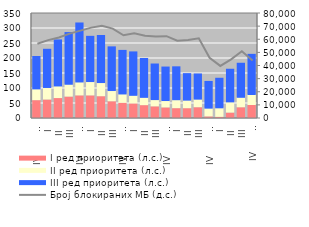
| Category | I ред приоритета (л.с.) | II ред приоритета (л.с.) | III ред приоритета (л.с.) |
|---|---|---|---|
| IV          2008. | 59.472 | 39.229 | 107.94 |
| I | 61.628 | 41.804 | 127.293 |
| II | 66.48 | 41.998 | 153.529 |
| III | 71.435 | 42.715 | 172.249 |
| IV          2009. | 75.406 | 46.374 | 196.604 |
| I | 75.387 | 47.741 | 150.747 |
| II | 72.673 | 47.129 | 156.885 |
| III | 55.827 | 37.398 | 145.555 |
| IV          2010. | 50.741 | 31.052 | 145.204 |
| I | 48.642 | 28.609 | 144.705 |
| II | 42.849 | 27.657 | 129.494 |
| III | 38.871 | 24.155 | 118.602 |
| IV          2011. | 35.298 | 24.577 | 111.631 |
| I | 32.81 | 29.818 | 109.618 |
| II | 32.726 | 28.5 | 88.254 |
| III | 35.976 | 28.552 | 83.929 |
| IV          2012. | 5.368 | 29.141 | 89.001 |
| I | 3.84 | 31.745 | 98.53 |
| II | 18.068 | 37.354 | 108.745 |
| III | 35.85 | 34.837 | 113.454 |
| IV         2013. | 43.264 | 36.761 | 133.818 |